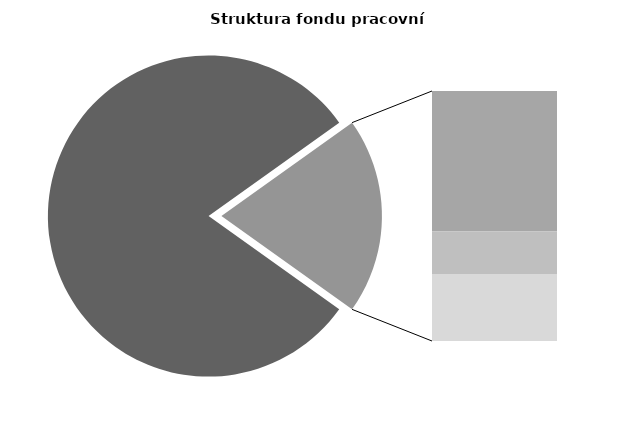
| Category | Series 0 |
|---|---|
| Průměrná měsíční odpracovaná doba bez přesčasu | 138.266 |
| Dovolená | 19.079 |
| Nemoc | 5.841 |
| Jiné | 9.114 |